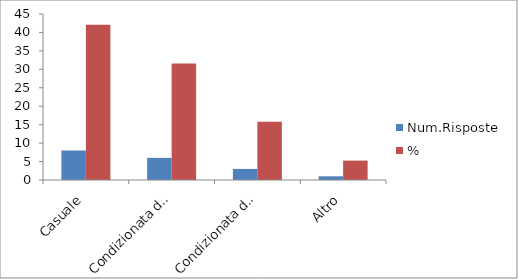
| Category | Num.Risposte | % |
|---|---|---|
| Casuale | 8 | 42.105 |
| Condizionata dalla vicinanza con l'abitazione in cui si trovava | 6 | 31.579 |
| Condizionata dal tipo di malattia | 3 | 15.789 |
| Altro | 1 | 5.263 |